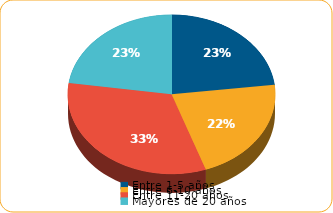
| Category | Series 0 |
|---|---|
| Entre 1-5 años | 3234.4 |
| Entre 6-10 años | 3022.5 |
| Entre 11-20 años | 4574.4 |
| Mayores de 20 años | 3180.7 |